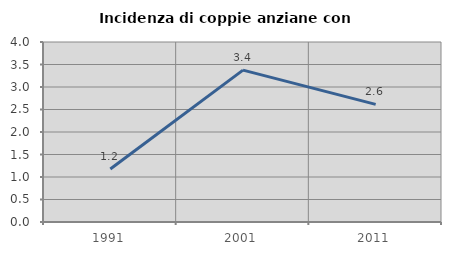
| Category | Incidenza di coppie anziane con figli |
|---|---|
| 1991.0 | 1.179 |
| 2001.0 | 3.374 |
| 2011.0 | 2.614 |